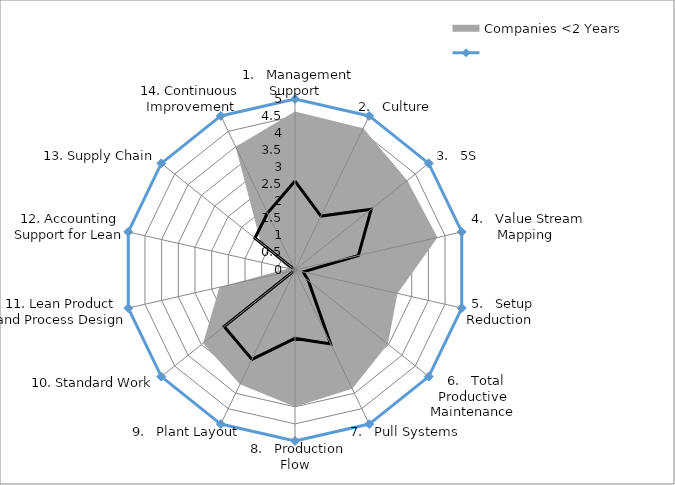
| Category | Companies <2 Years |
|---|---|
|   1.   Management Support | 2.318 |
|   2.   Culture | 2.3 |
|   3.   5S | 2.1 |
|   4.   Value Stream Mapping | 2.136 |
|   5.   Setup Reduction | 1.536 |
|   6.   Total Productive Maintenance | 1.736 |
|   7.   Pull Systems | 1.927 |
|   8.   Production Flow | 2 |
|   9.   Plant Layout | 1.855 |
| 10. Standard Work | 1.718 |
| 11. Lean Product and Process Design | 1.133 |
| 12. Accounting Support for Lean | 0.1 |
| 13. Supply Chain | 0.64 |
| 14. Continuous Improvement | 2 |